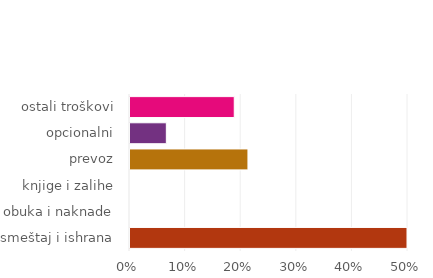
| Category | Series 0 |
|---|---|
| smeštaj i ishrana | 0.535 |
| obuka i naknade | 0 |
| knjige i zalihe | 0 |
| prevoz | 0.212 |
| opcionalni | 0.065 |
| ostali troškovi | 0.188 |